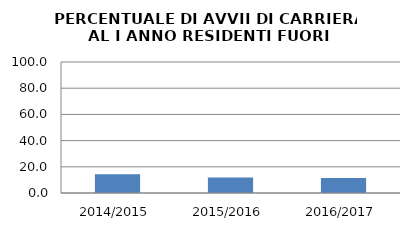
| Category | 2014/2015 2015/2016 2016/2017 |
|---|---|
| 2014/2015 | 14.286 |
| 2015/2016 | 11.765 |
| 2016/2017 | 11.429 |